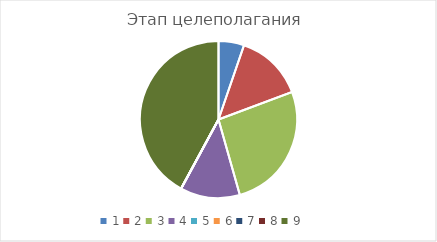
| Category | Series 0 |
|---|---|
| 0 | 0.059 |
| 1 | 0.157 |
| 2 | 0.294 |
| 3 | 0.137 |
| 4 | 0 |
| 5 | 0 |
| 6 | 0 |
| 7 | 0 |
| 8 | 0.471 |